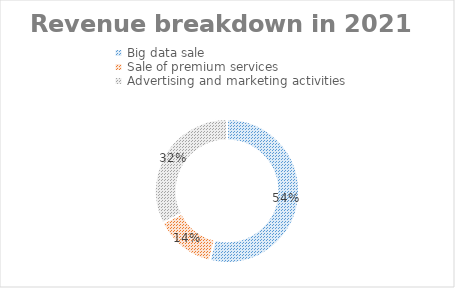
| Category | Big data sale |
|---|---|
| Big data sale | 0.539 |
| Sale of premium services | 0.137 |
| Advertising and marketing activities | 0.323 |